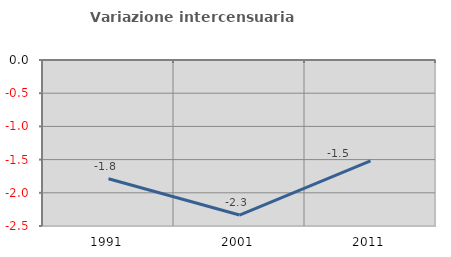
| Category | Variazione intercensuaria annua |
|---|---|
| 1991.0 | -1.788 |
| 2001.0 | -2.335 |
| 2011.0 | -1.52 |